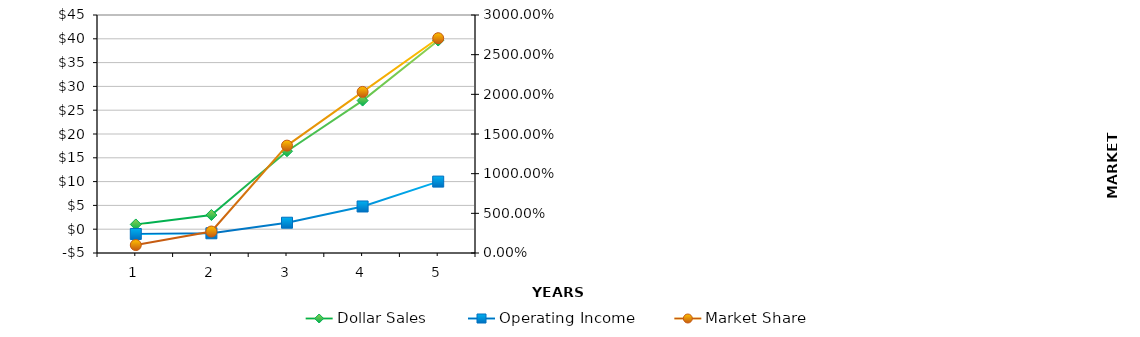
| Category | Dollar Sales | Operating Income |
|---|---|---|
| 0 | 1 | -1 |
| 1 | 2.978 | -0.856 |
| 2 | 16.377 | 1.36 |
| 3 | 27.023 | 4.774 |
| 4 | 39.633 | 10 |